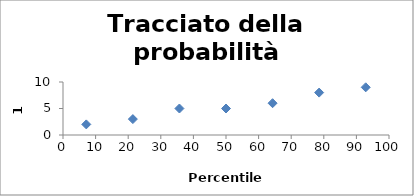
| Category | Series 0 |
|---|---|
| 7.142857142857143 | 2 |
| 21.42857142857143 | 3 |
| 35.714285714285715 | 5 |
| 50.00000000000001 | 5 |
| 64.28571428571429 | 6 |
| 78.57142857142857 | 8 |
| 92.85714285714286 | 9 |